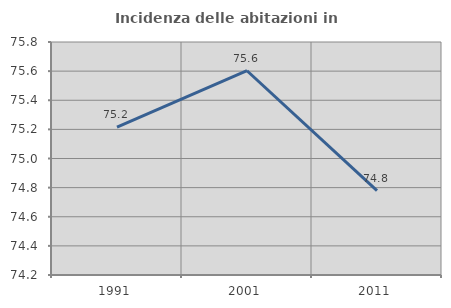
| Category | Incidenza delle abitazioni in proprietà  |
|---|---|
| 1991.0 | 75.216 |
| 2001.0 | 75.603 |
| 2011.0 | 74.78 |